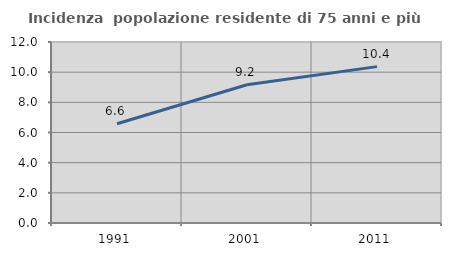
| Category | Incidenza  popolazione residente di 75 anni e più |
|---|---|
| 1991.0 | 6.577 |
| 2001.0 | 9.166 |
| 2011.0 | 10.368 |